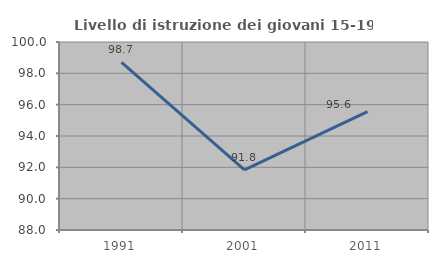
| Category | Livello di istruzione dei giovani 15-19 anni |
|---|---|
| 1991.0 | 98.701 |
| 2001.0 | 91.837 |
| 2011.0 | 95.556 |